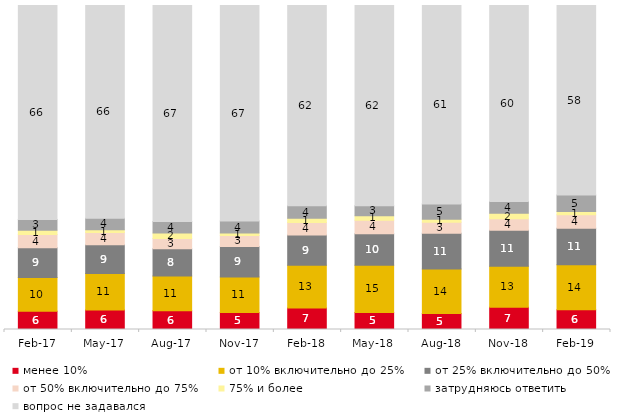
| Category | менее 10% | от 10% включительно до 25% | от 25% включительно до 50% | от 50% включительно до 75% | 75% и более | затрудняюсь ответить | вопрос не задавался |
|---|---|---|---|---|---|---|---|
| 2017-02-01 | 5.65 | 10.4 | 9.15 | 4.1 | 1.3 | 3.35 | 66.05 |
| 2017-05-01 | 6 | 11.3 | 8.85 | 3.75 | 0.9 | 3.55 | 65.65 |
| 2017-08-01 | 5.8 | 10.75 | 8.4 | 3.15 | 1.65 | 3.55 | 66.7 |
| 2017-11-01 | 5.25 | 10.95 | 9.4 | 3.45 | 0.7 | 3.75 | 66.5 |
| 2018-02-01 | 6.6 | 13.25 | 9.35 | 3.85 | 1.25 | 3.9 | 61.8 |
| 2018-05-01 | 5.25 | 14.6 | 9.7 | 4.2 | 1.35 | 3.1 | 61.8 |
| 2018-08-01 | 4.9 | 13.75 | 11.05 | 3.4 | 0.9 | 4.7 | 61.3 |
| 2018-11-01 | 6.886 | 12.625 | 11.128 | 3.543 | 1.697 | 3.643 | 60.479 |
| 2019-02-01 | 6.1 | 13.85 | 11.3 | 4.2 | 0.95 | 5.15 | 58.45 |